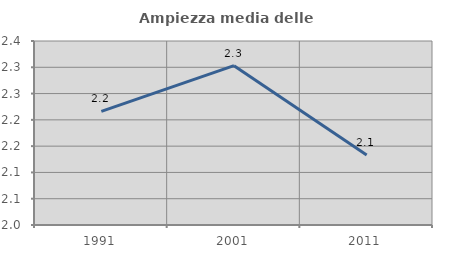
| Category | Ampiezza media delle famiglie |
|---|---|
| 1991.0 | 2.216 |
| 2001.0 | 2.303 |
| 2011.0 | 2.133 |